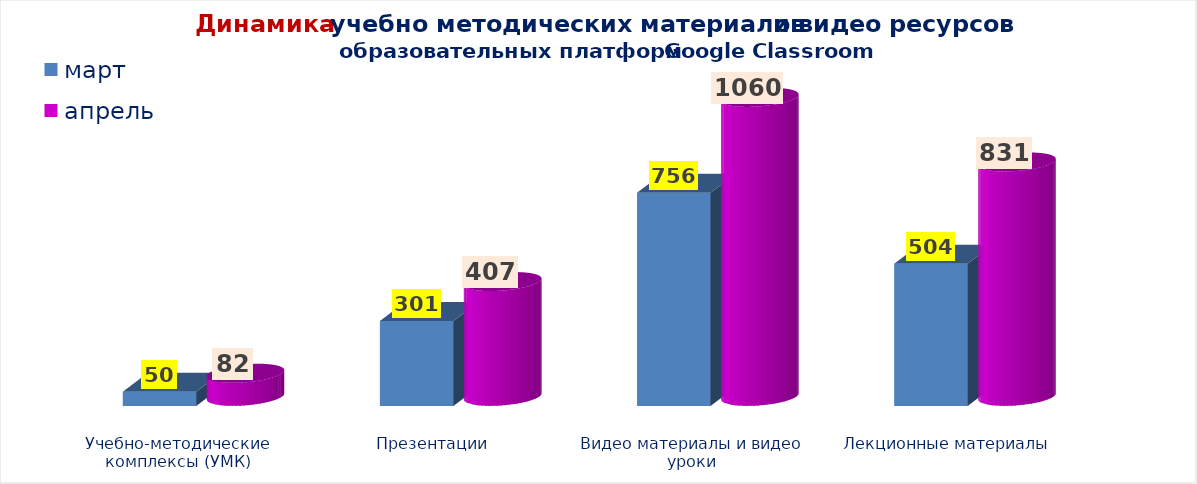
| Category | март | апрель |
|---|---|---|
| Учебно-методические комплексы (УМК) | 50 | 82 |
| Презентации | 301 | 407 |
| Видео материалы и видео уроки | 756 | 1060 |
| Лекционные материалы | 504 | 831 |